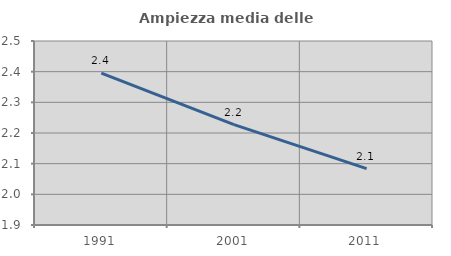
| Category | Ampiezza media delle famiglie |
|---|---|
| 1991.0 | 2.395 |
| 2001.0 | 2.227 |
| 2011.0 | 2.084 |